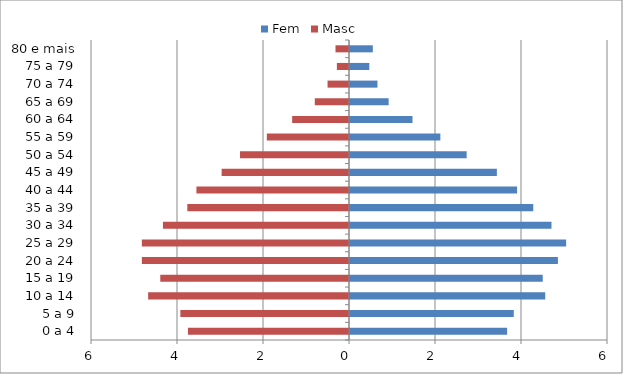
| Category | Fem | Masc |
|---|---|---|
| 0 a 4 | 3.654 | -3.746 |
| 5 a 9 | 3.809 | -3.922 |
| 10 a 14 | 4.54 | -4.672 |
| 15 a 19 | 4.483 | -4.389 |
| 20 a 24 | 4.835 | -4.817 |
| 25 a 29 | 5.027 | -4.818 |
| 30 a 34 | 4.686 | -4.327 |
| 35 a 39 | 4.262 | -3.76 |
| 40 a 44 | 3.886 | -3.548 |
| 45 a 49 | 3.416 | -2.962 |
| 50 a 54 | 2.713 | -2.535 |
| 55 a 59 | 2.101 | -1.911 |
| 60 a 64 | 1.453 | -1.322 |
| 65 a 69 | 0.898 | -0.795 |
| 70 a 74 | 0.638 | -0.499 |
| 75 a 79 | 0.449 | -0.282 |
| 80 e mais | 0.531 | -0.314 |